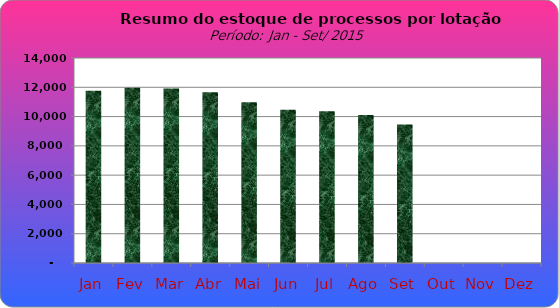
| Category | Series 0 |
|---|---|
| Jan | 11768 |
| Fev | 11973 |
| Mar | 11918 |
| Abr | 11669 |
| Mai | 10977 |
| Jun | 10462 |
| Jul | 10364 |
| Ago | 10110 |
| Set | 9465 |
| Out | 0 |
| Nov | 0 |
| Dez | 0 |